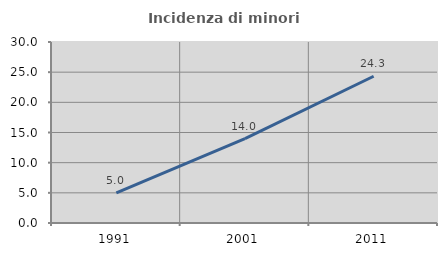
| Category | Incidenza di minori stranieri |
|---|---|
| 1991.0 | 5 |
| 2001.0 | 13.978 |
| 2011.0 | 24.324 |